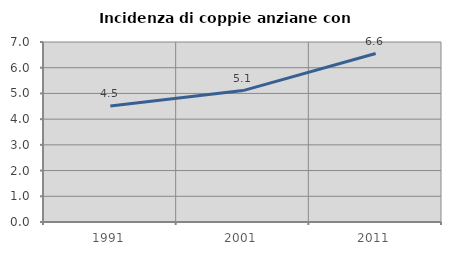
| Category | Incidenza di coppie anziane con figli |
|---|---|
| 1991.0 | 4.515 |
| 2001.0 | 5.111 |
| 2011.0 | 6.55 |